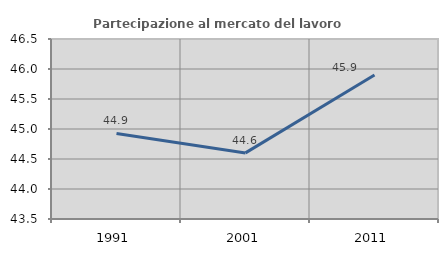
| Category | Partecipazione al mercato del lavoro  femminile |
|---|---|
| 1991.0 | 44.926 |
| 2001.0 | 44.602 |
| 2011.0 | 45.9 |